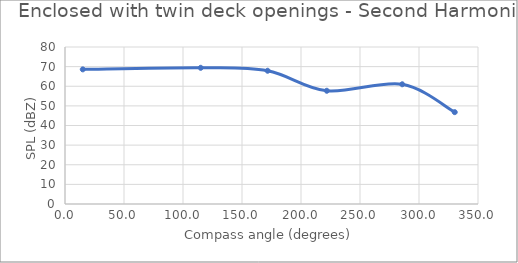
| Category | Series 0 |
|---|---|
| 15.06445125542554 | 68.6 |
| 115.00449447818254 | 69.4 |
| 171.7068171198818 | 67.9 |
| 221.8691292075067 | 57.7 |
| 285.7828166838848 | 61 |
| 330.28010595813004 | 46.8 |